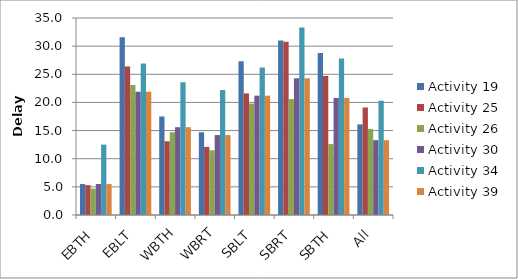
| Category | Activity 19 | Activity 25 | Activity 26 | Activity 30 | Activity 34 | Activity 39 |
|---|---|---|---|---|---|---|
| EBTH | 5.5 | 5.3 | 4.7 | 5.5 | 12.5 | 5.5 |
| EBLT | 31.6 | 26.4 | 23.1 | 21.9 | 26.9 | 21.9 |
| WBTH | 17.5 | 13.1 | 14.7 | 15.6 | 23.6 | 15.6 |
| WBRT | 14.7 | 12.1 | 11.5 | 14.2 | 22.2 | 14.2 |
| SBLT | 27.3 | 21.6 | 19.8 | 21.2 | 26.2 | 21.2 |
| SBRT | 31 | 30.8 | 20.6 | 24.3 | 33.3 | 24.3 |
| SBTH | 28.8 | 24.7 | 12.6 | 20.8 | 27.8 | 20.8 |
| All | 16.1 | 19.1 | 15.3 | 13.3 | 20.3 | 13.3 |